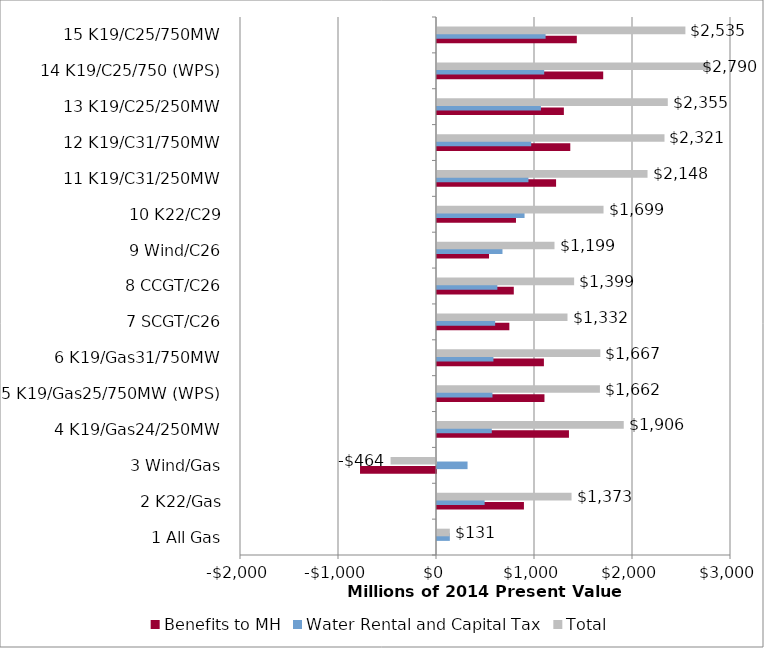
| Category | Benefits to MH | Water Rental and Capital Tax | Total |
|---|---|---|---|
| 1 All Gas | 0 | 130.922 | 130.922 |
| 2 K22/Gas | 887.022 | 485.95 | 1372.972 |
| 3 Wind/Gas | -775.263 | 311.716 | -463.547 |
| 4 K19/Gas24/250MW | 1346.49 | 559.128 | 1905.617 |
| 5 K19/Gas25/750MW (WPS) | 1096.585 | 565.88 | 1662.465 |
| 6 K19/Gas31/750MW | 1090.843 | 575.808 | 1666.652 |
| 7 SCGT/C26 | 738.254 | 593.427 | 1331.681 |
| 8 CCGT/C26 | 783.616 | 615.815 | 1399.432 |
| 9 Wind/C26 | 530.853 | 668.132 | 1198.984 |
| 10 K22/C29 | 805.92 | 893.447 | 1699.366 |
| 11 K19/C31/250MW | 1215.107 | 933.219 | 2148.326 |
| 12 K19/C31/750MW | 1360.108 | 961.271 | 2321.379 |
| 13 K19/C25/250MW | 1294.53 | 1060.513 | 2355.043 |
| 14 K19/C25/750 (WPS) | 1696.013 | 1093.934 | 2789.947 |
| 15 K19/C25/750MW | 1426.618 | 1108.109 | 2534.728 |